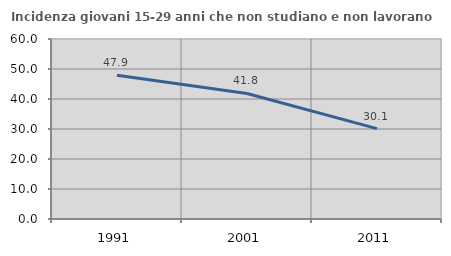
| Category | Incidenza giovani 15-29 anni che non studiano e non lavorano  |
|---|---|
| 1991.0 | 47.937 |
| 2001.0 | 41.848 |
| 2011.0 | 30.128 |